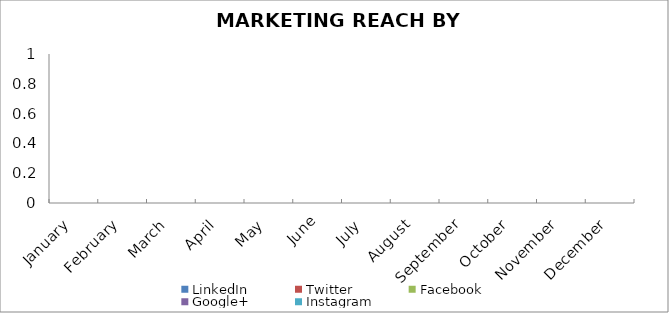
| Category | LinkedIn | Twitter | Facebook | Google+ | Instagram |
|---|---|---|---|---|---|
| January | 0 | 0 | 0 | 0 | 0 |
| February | 0 | 0 | 0 | 0 | 0 |
| March | 0 | 0 | 0 | 0 | 0 |
| April | 0 | 0 | 0 | 0 | 0 |
| May | 0 | 0 | 0 | 0 | 0 |
| June | 0 | 0 | 0 | 0 | 0 |
| July | 0 | 0 | 0 | 0 | 0 |
| August  | 0 | 0 | 0 | 0 | 0 |
| September | 0 | 0 | 0 | 0 | 0 |
| October | 0 | 0 | 0 | 0 | 0 |
| November | 0 | 0 | 0 | 0 | 0 |
| December | 0 | 0 | 0 | 0 | 0 |